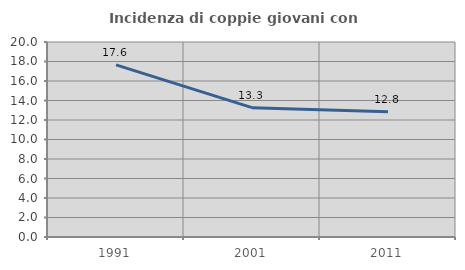
| Category | Incidenza di coppie giovani con figli |
|---|---|
| 1991.0 | 17.647 |
| 2001.0 | 13.265 |
| 2011.0 | 12.836 |